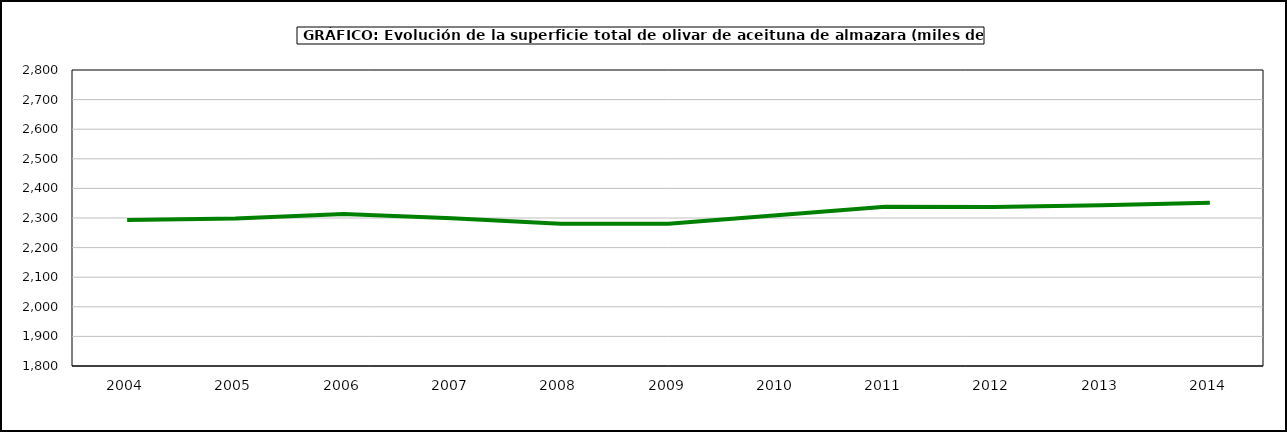
| Category | superficie |
|---|---|
| 2004.0 | 2293.462 |
| 2005.0 | 2298.45 |
| 2006.0 | 2313.869 |
| 2007.0 | 2299.322 |
| 2008.0 | 2280.579 |
| 2009.0 | 2280.456 |
| 2010.0 | 2309.46 |
| 2011.0 | 2337.913 |
| 2012.0 | 2337.582 |
| 2013.0 | 2343.184 |
| 2014.0 | 2351.428 |